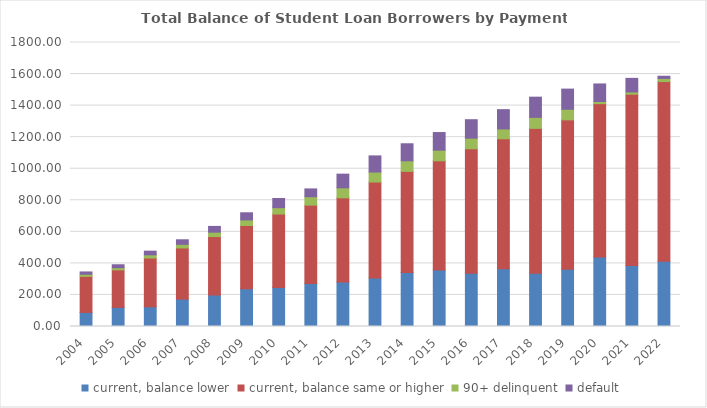
| Category | current, balance lower | current, balance same or higher | 90+ delinquent | default |
|---|---|---|---|---|
| 2004.0 | 89.16 | 228.72 | 13.37 | 14.57 |
| 2005.0 | 120.92 | 238.11 | 13.54 | 18.81 |
| 2006.0 | 124.83 | 309.09 | 20.31 | 23.3 |
| 2007.0 | 173.61 | 324.25 | 22.73 | 29.04 |
| 2008.0 | 199.35 | 370.67 | 27.7 | 36.57 |
| 2009.0 | 239.29 | 400.8 | 35.35 | 45.33 |
| 2010.0 | 247.94 | 464.67 | 40.59 | 58.04 |
| 2011.0 | 272.87 | 496.27 | 53.44 | 49.47 |
| 2012.0 | 282.35 | 532.96 | 63.66 | 86.64 |
| 2013.0 | 306.7 | 608.81 | 63.3 | 102.54 |
| 2014.0 | 342.03 | 641.2 | 66.97 | 108.03 |
| 2015.0 | 357.37 | 692.79 | 67.43 | 111.8 |
| 2016.0 | 338.15 | 788.28 | 67.02 | 117.25 |
| 2017.0 | 366.1 | 823.71 | 62.28 | 122.35 |
| 2018.0 | 338.18 | 917.62 | 69.64 | 128.06 |
| 2019.0 | 363.38 | 946.23 | 67.04 | 127.9 |
| 2020.0 | 440.85 | 971.63 | 13.45 | 111.41 |
| 2021.0 | 386.49 | 1085.75 | 14.35 | 86.08 |
| 2022.0 | 413.99 | 1138.53 | 19.79 | 13.83 |